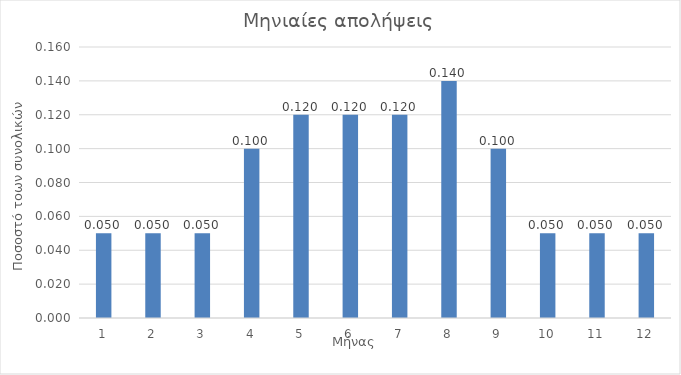
| Category | Series 0 |
|---|---|
| 1.0 | 0.05 |
| 2.0 | 0.05 |
| 3.0 | 0.05 |
| 4.0 | 0.1 |
| 5.0 | 0.12 |
| 6.0 | 0.12 |
| 7.0 | 0.12 |
| 8.0 | 0.14 |
| 9.0 | 0.1 |
| 10.0 | 0.05 |
| 11.0 | 0.05 |
| 12.0 | 0.05 |